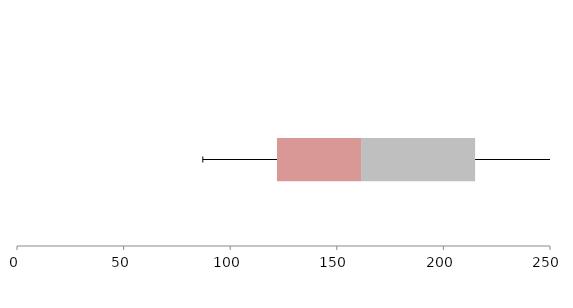
| Category | Series 1 | Series 2 | Series 3 |
|---|---|---|---|
| 0 | 121.941 | 39.441 | 53.492 |